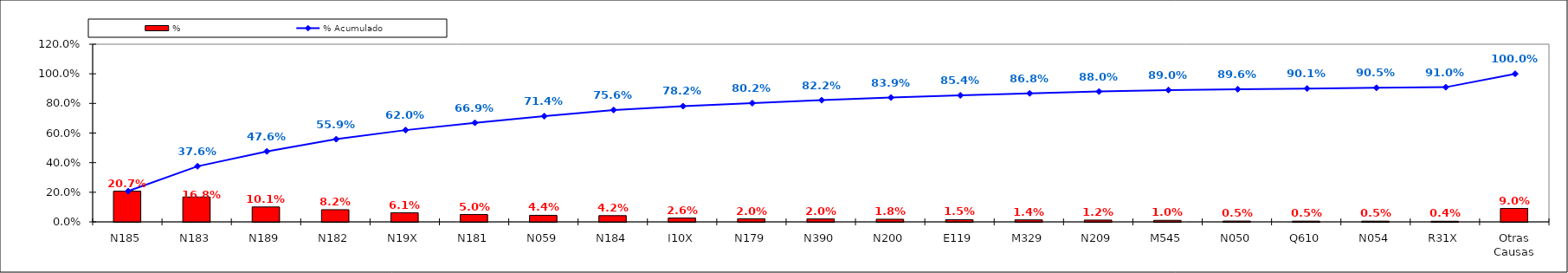
| Category | % |
|---|---|
| N185 | 0.207 |
| N183 | 0.168 |
| N189 | 0.101 |
| N182 | 0.082 |
| N19X | 0.061 |
| N181 | 0.05 |
| N059 | 0.044 |
| N184 | 0.042 |
| I10X | 0.026 |
| N179 | 0.02 |
| N390 | 0.02 |
| N200 | 0.018 |
| E119 | 0.015 |
| M329 | 0.014 |
| N209 | 0.012 |
| M545 | 0.01 |
| N050 | 0.005 |
| Q610 | 0.005 |
| N054 | 0.005 |
| R31X | 0.004 |
| Otras Causas | 0.09 |